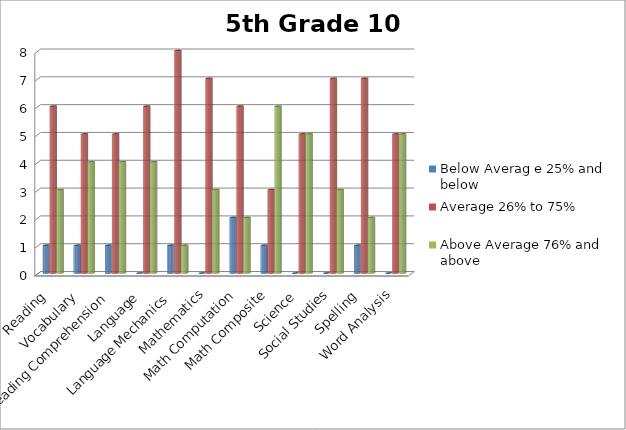
| Category | Below Averag e 25% and below | Average 26% to 75% | Above Average 76% and above |
|---|---|---|---|
| Reading  | 1 | 6 | 3 |
| Vocabulary | 1 | 5 | 4 |
| Reading Comprehension | 1 | 5 | 4 |
| Language | 0 | 6 | 4 |
| Language Mechanics | 1 | 8 | 1 |
| Mathematics | 0 | 7 | 3 |
| Math Computation | 2 | 6 | 2 |
| Math Composite | 1 | 3 | 6 |
| Science | 0 | 5 | 5 |
| Social Studies | 0 | 7 | 3 |
| Spelling | 1 | 7 | 2 |
| Word Analysis | 0 | 5 | 5 |